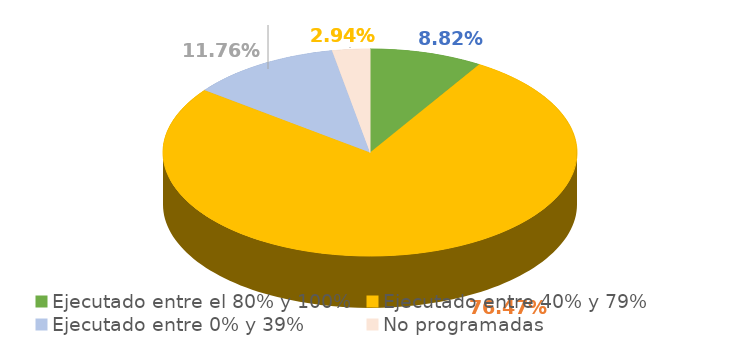
| Category | Series 0 |
|---|---|
| Ejecutado entre el 80% y 100% | 0.088 |
| Ejecutado entre 40% y 79% | 0.765 |
| Ejecutado entre 0% y 39% | 0.118 |
| No programadas | 0.029 |